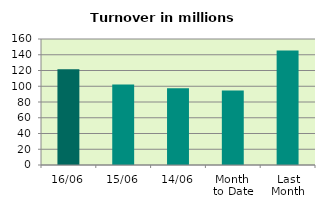
| Category | Series 0 |
|---|---|
| 16/06 | 121.495 |
| 15/06 | 102.113 |
| 14/06 | 97.441 |
| Month 
to Date | 94.633 |
| Last
Month | 145.388 |